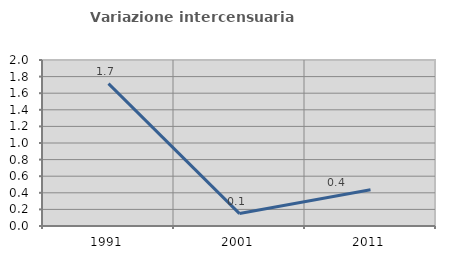
| Category | Variazione intercensuaria annua |
|---|---|
| 1991.0 | 1.715 |
| 2001.0 | 0.15 |
| 2011.0 | 0.437 |